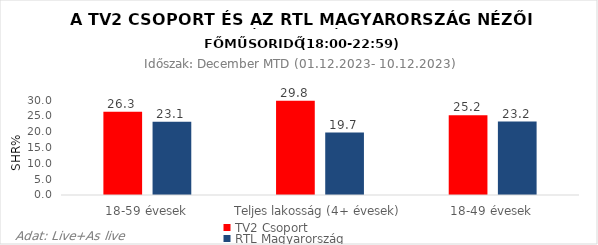
| Category | TV2 Csoport | RTL Magyarország |
|---|---|---|
| 18-59 évesek | 26.3 | 23.1 |
| Teljes lakosság (4+ évesek) | 29.8 | 19.7 |
| 18-49 évesek | 25.2 | 23.2 |